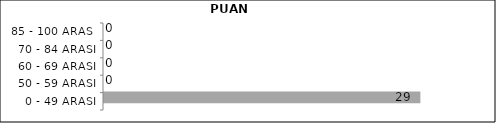
| Category | Series 0 | Series 1 | Series 2 |
|---|---|---|---|
| 0 - 49 ARASI |  |  | 29 |
| 50 - 59 ARASI |  |  | 0 |
| 60 - 69 ARASI |  |  | 0 |
| 70 - 84 ARASI |  |  | 0 |
| 85 - 100 ARASI |  |  | 0 |